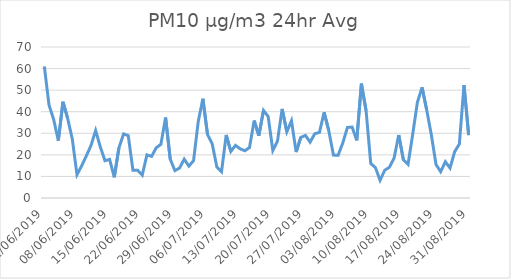
| Category | PM10 |
|---|---|
| 01/06/2019 | 61 |
| 02/06/2019 | 43.1 |
| 03/06/2019 | 36.4 |
| 04/06/2019 | 26.6 |
| 05/06/2019 | 44.6 |
| 06/06/2019 | 36.9 |
| 07/06/2019 | 27.3 |
| 08/06/2019 | 10.8 |
| 09/06/2019 | 14.9 |
| 10/06/2019 | 19.5 |
| 11/06/2019 | 24.3 |
| 12/06/2019 | 31.3 |
| 13/06/2019 | 23.7 |
| 14/06/2019 | 17.3 |
| 15/06/2019 | 17.9 |
| 16/06/2019 | 9.6 |
| 17/06/2019 | 23.3 |
| 18/06/2019 | 29.7 |
| 19/06/2019 | 28.9 |
| 20/06/2019 | 12.9 |
| 21/06/2019 | 12.9 |
| 22/06/2019 | 10.6 |
| 23/06/2019 | 20 |
| 24/06/2019 | 19.3 |
| 25/06/2019 | 23.3 |
| 26/06/2019 | 24.9 |
| 27/06/2019 | 37.3 |
| 28/06/2019 | 18 |
| 29/06/2019 | 12.7 |
| 30/06/2019 | 13.9 |
| 01/07/2019 | 18 |
| 02/07/2019 | 14.8 |
| 03/07/2019 | 17.3 |
| 04/07/2019 | 35.4 |
| 05/07/2019 | 46 |
| 06/07/2019 | 29.4 |
| 07/07/2019 | 25.1 |
| 08/07/2019 | 14.4 |
| 09/07/2019 | 12.2 |
| 10/07/2019 | 29.2 |
| 11/07/2019 | 21.6 |
| 12/07/2019 | 24.4 |
| 13/07/2019 | 22.8 |
| 14/07/2019 | 21.9 |
| 15/07/2019 | 23.4 |
| 16/07/2019 | 35.9 |
| 17/07/2019 | 28.9 |
| 18/07/2019 | 40.6 |
| 19/07/2019 | 37.8 |
| 20/07/2019 | 22 |
| 21/07/2019 | 26.4 |
| 22/07/2019 | 41.3 |
| 23/07/2019 | 30.7 |
| 24/07/2019 | 35.8 |
| 25/07/2019 | 21.3 |
| 26/07/2019 | 28.1 |
| 27/07/2019 | 29 |
| 28/07/2019 | 25.9 |
| 29/07/2019 | 29.8 |
| 30/07/2019 | 30.4 |
| 31/07/2019 | 39.7 |
| 01/08/2019 | 31.2 |
| 02/08/2019 | 19.9 |
| 03/08/2019 | 19.8 |
| 04/08/2019 | 25.5 |
| 05/08/2019 | 32.7 |
| 06/08/2019 | 32.9 |
| 07/08/2019 | 26.7 |
| 08/08/2019 | 53 |
| 09/08/2019 | 40.5 |
| 10/08/2019 | 16 |
| 11/08/2019 | 14.1 |
| 12/08/2019 | 8.2 |
| 13/08/2019 | 12.9 |
| 14/08/2019 | 14.3 |
| 15/08/2019 | 18.4 |
| 16/08/2019 | 29.2 |
| 17/08/2019 | 17.7 |
| 18/08/2019 | 15.6 |
| 19/08/2019 | 29.6 |
| 20/08/2019 | 44.3 |
| 21/08/2019 | 51.3 |
| 22/08/2019 | 40.8 |
| 23/08/2019 | 29.2 |
| 24/08/2019 | 15.5 |
| 25/08/2019 | 12.2 |
| 26/08/2019 | 16.8 |
| 27/08/2019 | 13.9 |
| 28/08/2019 | 21.5 |
| 29/08/2019 | 25 |
| 30/08/2019 | 52.3 |
| 31/08/2019 | 29.2 |